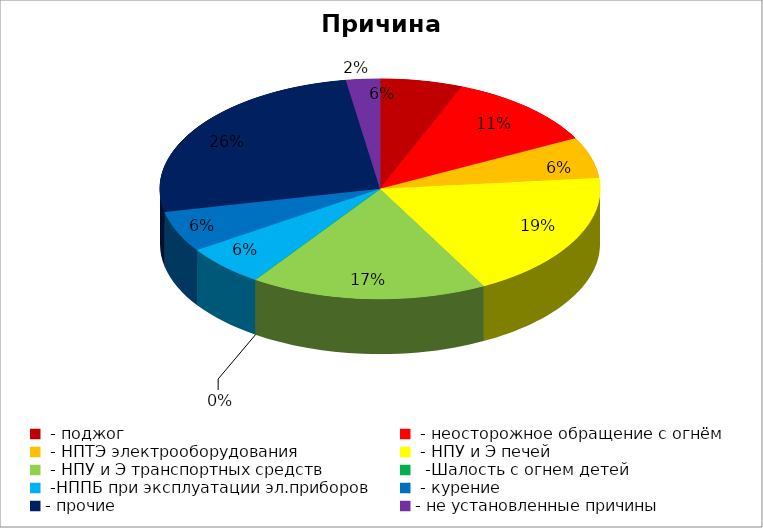
| Category | Причина пожара |
|---|---|
|  - поджог | 17 |
|  - неосторожное обращение с огнём | 32 |
|  - НПТЭ электрооборудования | 17 |
|  - НПУ и Э печей | 53 |
|  - НПУ и Э транспортных средств | 49 |
|   -Шалость с огнем детей | 0 |
|  -НППБ при эксплуатации эл.приборов | 17 |
|  - курение | 17 |
| - прочие | 73 |
| - не установленные причины | 7 |